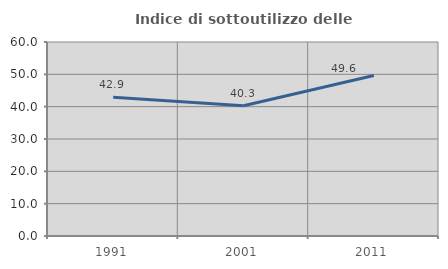
| Category | Indice di sottoutilizzo delle abitazioni  |
|---|---|
| 1991.0 | 42.929 |
| 2001.0 | 40.258 |
| 2011.0 | 49.637 |